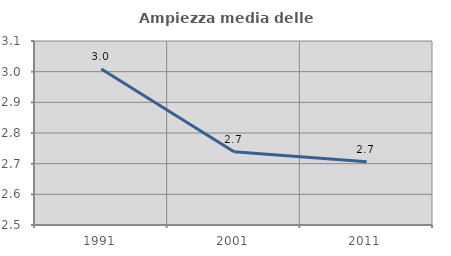
| Category | Ampiezza media delle famiglie |
|---|---|
| 1991.0 | 3.008 |
| 2001.0 | 2.739 |
| 2011.0 | 2.706 |